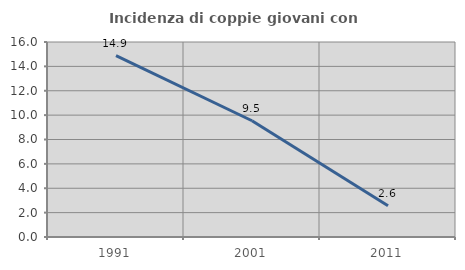
| Category | Incidenza di coppie giovani con figli |
|---|---|
| 1991.0 | 14.885 |
| 2001.0 | 9.539 |
| 2011.0 | 2.572 |